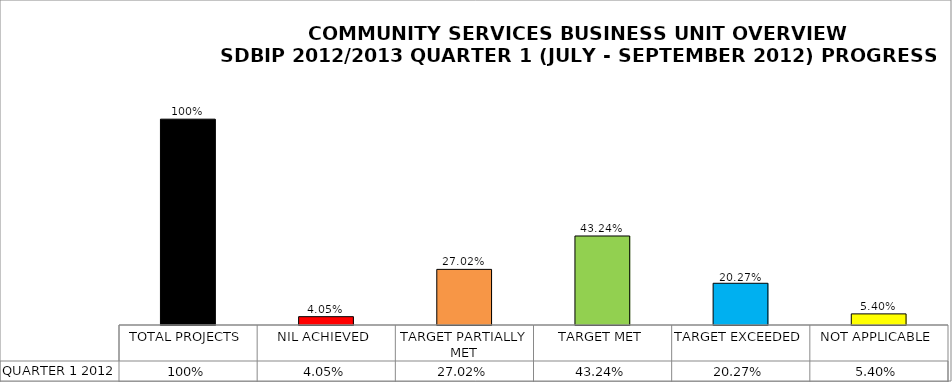
| Category | QUARTER 1 2012 |
|---|---|
| TOTAL PROJECTS | 1 |
| NIL ACHIEVED | 0.04 |
| TARGET PARTIALLY MET | 0.27 |
| TARGET MET | 0.432 |
| TARGET EXCEEDED | 0.203 |
| NOT APPLICABLE | 0.054 |